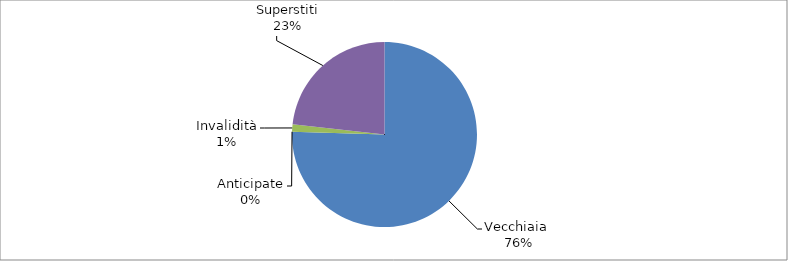
| Category | Series 0 |
|---|---|
| Vecchiaia  | 30272 |
| Anticipate | 0 |
| Invalidità | 523 |
| Superstiti | 9314 |